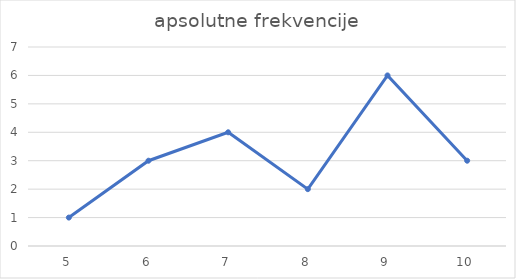
| Category | apsolutne frekvencije |
|---|---|
| 5.0 | 1 |
| 6.0 | 3 |
| 7.0 | 4 |
| 8.0 | 2 |
| 9.0 | 6 |
| 10.0 | 3 |